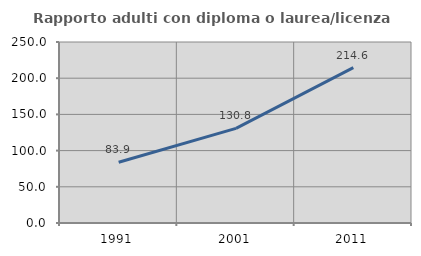
| Category | Rapporto adulti con diploma o laurea/licenza media  |
|---|---|
| 1991.0 | 83.851 |
| 2001.0 | 130.769 |
| 2011.0 | 214.625 |